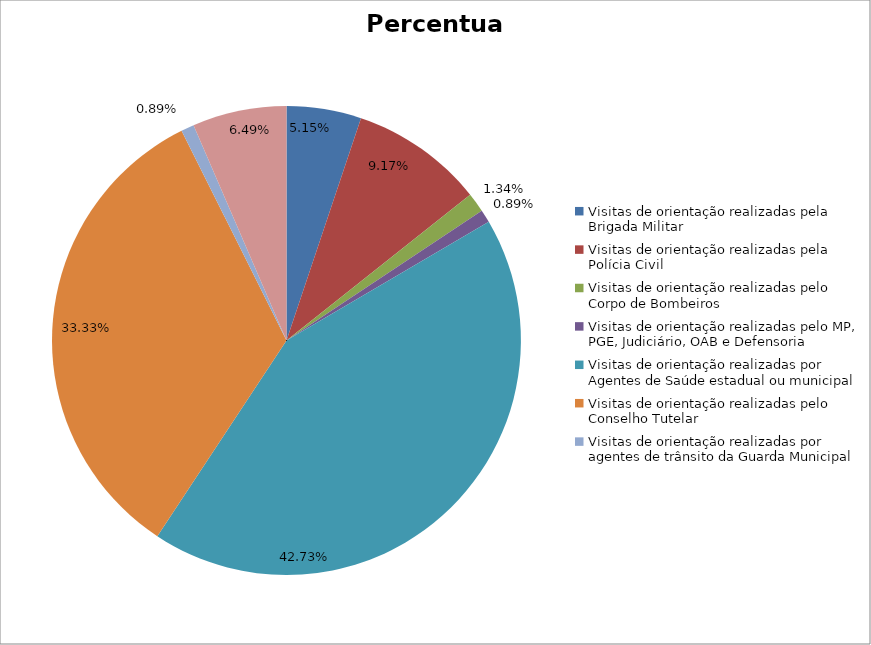
| Category | Percentual |
|---|---|
| Visitas de orientação realizadas pela Brigada Militar | 0.051 |
| Visitas de orientação realizadas pela Polícia Civil | 0.092 |
| Visitas de orientação realizadas pelo Corpo de Bombeiros | 0.013 |
| Visitas de orientação realizadas pelo MP, PGE, Judiciário, OAB e Defensoria | 0.009 |
| Visitas de orientação realizadas por Agentes de Saúde estadual ou municipal | 0.427 |
| Visitas de orientação realizadas pelo Conselho Tutelar | 0.333 |
| Visitas de orientação realizadas por agentes de trânsito da Guarda Municipal | 0.009 |
| Visitas de orientação realizadas por ONGs, entidades privadas, CRAS e CREAS | 0.065 |